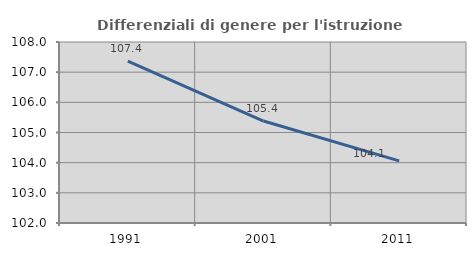
| Category | Differenziali di genere per l'istruzione superiore |
|---|---|
| 1991.0 | 107.366 |
| 2001.0 | 105.38 |
| 2011.0 | 104.061 |